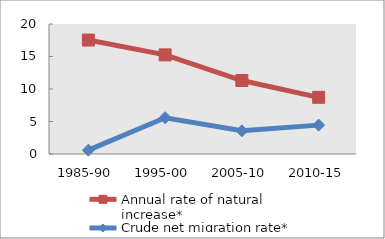
| Category | Annual rate of natural increase* | Crude net migration rate* |
|---|---|---|
| 1985-90 | 17.531 | 0.589 |
| 1995-00 | 15.248 | 5.582 |
| 2005-10 | 11.308 | 3.565 |
| 2010-15 | 8.72 | 4.443 |